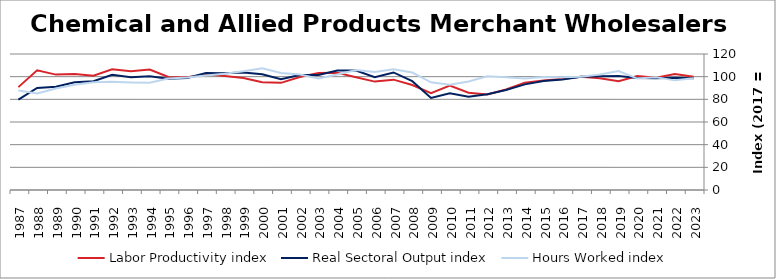
| Category | Labor Productivity index | Real Sectoral Output index | Hours Worked index |
|---|---|---|---|
| 2023.0 | 100.014 | 98.658 | 98.644 |
| 2022.0 | 102.291 | 98.953 | 96.737 |
| 2021.0 | 99.058 | 98.565 | 99.503 |
| 2020.0 | 100.607 | 98.895 | 98.298 |
| 2019.0 | 95.903 | 100.661 | 104.961 |
| 2018.0 | 98.612 | 100.412 | 101.825 |
| 2017.0 | 100 | 100 | 100 |
| 2016.0 | 97.894 | 97.417 | 99.513 |
| 2015.0 | 96.564 | 96.264 | 99.69 |
| 2014.0 | 94.724 | 93.202 | 98.393 |
| 2013.0 | 88.694 | 88.219 | 99.464 |
| 2012.0 | 84.338 | 84.555 | 100.257 |
| 2011.0 | 85.831 | 82.219 | 95.792 |
| 2010.0 | 92.055 | 85.416 | 92.787 |
| 2009.0 | 85.463 | 81.169 | 94.975 |
| 2008.0 | 92.628 | 96.03 | 103.673 |
| 2007.0 | 97.371 | 103.716 | 106.516 |
| 2006.0 | 95.647 | 99.585 | 104.118 |
| 2005.0 | 99.548 | 105.333 | 105.812 |
| 2004.0 | 103.428 | 105.425 | 101.931 |
| 2003.0 | 103.295 | 101.575 | 98.335 |
| 2002.0 | 99.728 | 101.545 | 101.822 |
| 2001.0 | 94.529 | 97.654 | 103.306 |
| 2000.0 | 95.114 | 102.192 | 107.442 |
| 1999.0 | 98.906 | 103.713 | 104.861 |
| 1998.0 | 100.522 | 103.107 | 102.572 |
| 1997.0 | 102.131 | 103.154 | 101.002 |
| 1996.0 | 99.59 | 98.887 | 99.294 |
| 1995.0 | 99.75 | 98.174 | 98.42 |
| 1994.0 | 106.219 | 100.432 | 94.552 |
| 1993.0 | 104.738 | 99.392 | 94.895 |
| 1992.0 | 106.439 | 101.663 | 95.513 |
| 1991.0 | 100.823 | 95.931 | 95.148 |
| 1990.0 | 102.244 | 95.017 | 92.932 |
| 1989.0 | 101.822 | 91.165 | 89.534 |
| 1988.0 | 105.635 | 90.051 | 85.248 |
| 1987.0 | 90.77 | 79.676 | 87.779 |